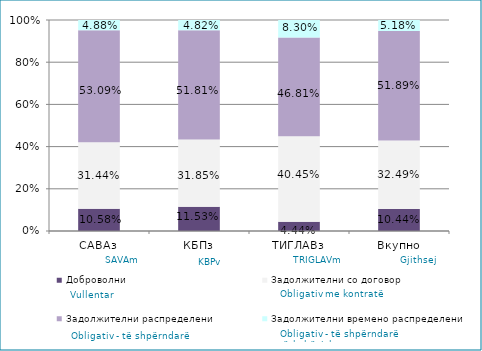
| Category | Доброволни  | Задолжителни со договор  | Задолжителни распределени  | Задолжителни времено распределени  |
|---|---|---|---|---|
| САВАз | 0.106 | 0.314 | 0.531 | 0.049 |
| КБПз | 0.115 | 0.318 | 0.518 | 0.048 |
| ТИГЛАВз | 0.044 | 0.405 | 0.468 | 0.083 |
| Вкупно | 0.104 | 0.325 | 0.519 | 0.052 |